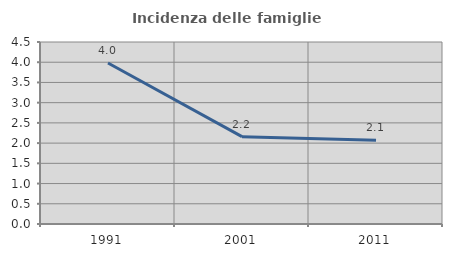
| Category | Incidenza delle famiglie numerose |
|---|---|
| 1991.0 | 3.98 |
| 2001.0 | 2.16 |
| 2011.0 | 2.074 |